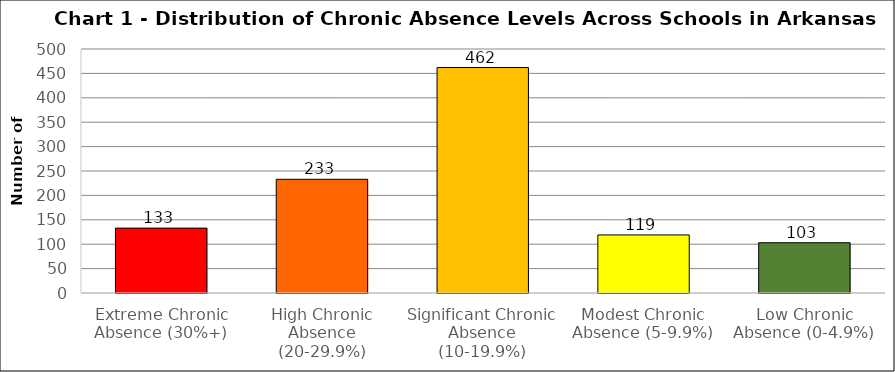
| Category | Series 0 |
|---|---|
| Extreme Chronic Absence (30%+) | 133 |
| High Chronic Absence (20-29.9%) | 233 |
| Significant Chronic Absence (10-19.9%) | 462 |
| Modest Chronic Absence (5-9.9%) | 119 |
| Low Chronic Absence (0-4.9%) | 103 |